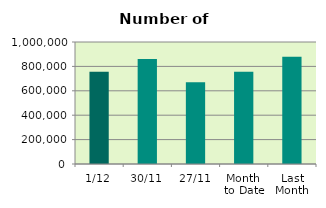
| Category | Series 0 |
|---|---|
| 1/12 | 756222 |
| 30/11 | 859836 |
| 27/11 | 669500 |
| Month 
to Date | 756222 |
| Last
Month | 879957.333 |